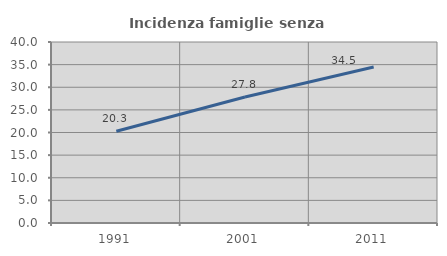
| Category | Incidenza famiglie senza nuclei |
|---|---|
| 1991.0 | 20.273 |
| 2001.0 | 27.84 |
| 2011.0 | 34.456 |